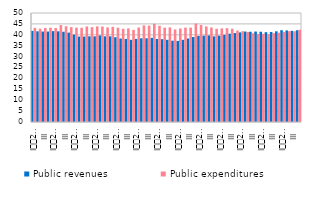
| Category | Public revenues | Public expenditures |
|---|---|---|
| I
2007 | 41.8 | 43.2 |
| II | 41.6 | 42.792 |
| III | 41.5 | 43.161 |
| IV | 41.5 | 43.268 |
| I
2008 | 41.7 | 43.139 |
| II | 41.6 | 44.449 |
| III | 41.4 | 43.897 |
| IV | 41 | 43.511 |
| I
2009 | 40.1 | 43.301 |
| II | 39.2 | 43.223 |
| III | 39.2 | 43.838 |
| IV | 39.3 | 43.508 |
| I
2010 | 39.3 | 43.863 |
| II | 39.7 | 43.782 |
| III | 39.3 | 43.371 |
| IV | 39.3 | 43.668 |
| I
2011 | 38.9 | 43.234 |
| II | 38.3 | 42.761 |
| III | 38.1 | 42.925 |
| IV | 37.7 | 42.248 |
| I
2012 | 38.1 | 43.358 |
| II | 38.4 | 44.317 |
| III | 38.4 | 44.213 |
| IV | 38.6 | 45.073 |
| I
2013 | 38.1 | 44.124 |
| II | 38 | 43.272 |
| III | 37.7 | 43.393 |
| IV | 37.3 | 42.467 |
| I
2014 | 37.2 | 42.885 |
| II | 37.7 | 43.315 |
| III | 38.3 | 43.303 |
| IV | 39 | 45.159 |
| I
2015 | 39.5 | 44.522 |
| II | 39.6 | 43.838 |
| III | 39.7 | 43.382 |
| IV | 39.3 | 42.763 |
| I
2016 | 39.6 | 42.941 |
| II | 40 | 43.04 |
| III | 40.5 | 42.804 |
| IV | 40.8 | 41.95 |
| I
2017 | 41.1 | 41.639 |
| II | 41.5 | 41.305 |
| III | 41.4 | 40.697 |
| IV | 41.5 | 40.407 |
| I
2018 | 41.4 | 40.457 |
| II | 41.2 | 40.307 |
| III | 41.3 | 40.745 |
| IV | 41.6 | 40.972 |
| I
2019 | 42.1 | 41.324 |
| II | 42 | 41.677 |
| III | 41.8 | 41.616 |
| IV | 42.1 | 42.319 |